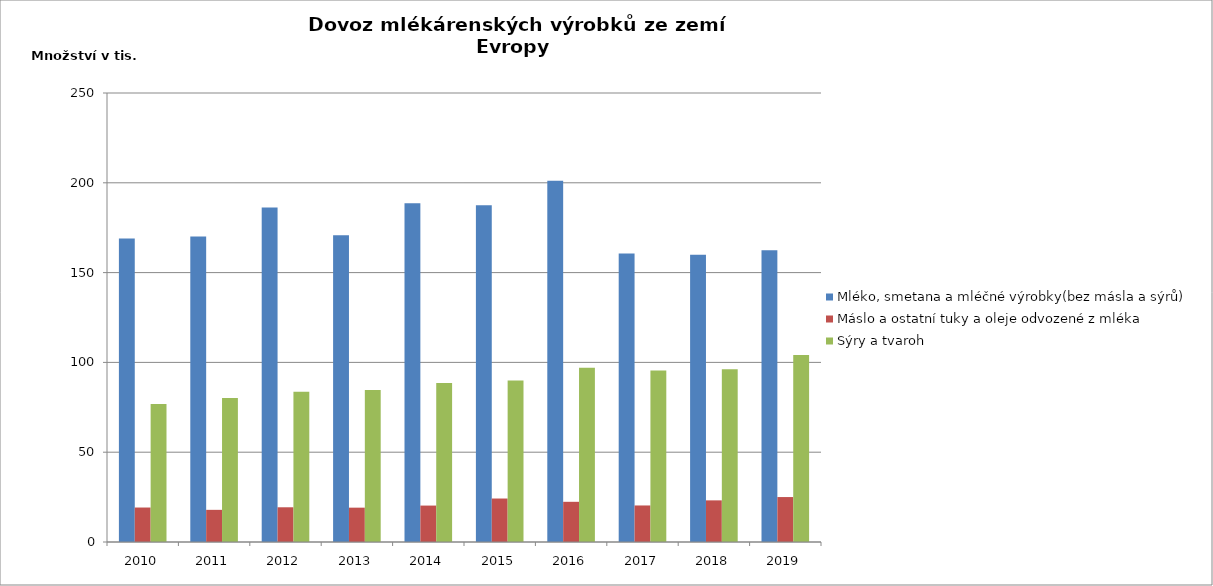
| Category | Mléko, smetana a mléčné výrobky(bez másla a sýrů)  | Máslo a ostatní tuky a oleje odvozené z mléka | Sýry a tvaroh |
|---|---|---|---|
| 2010 | 168991699 | 19196060 | 76845176 |
| 2011 | 170124145 | 17902958 | 80138963 |
| 2012 | 186308942 | 19334351 | 83708218 |
| 2013 | 170851050 | 19121034 | 84694131 |
| 2014 | 188625632 | 20281822 | 88524573 |
| 2015 | 187476154 | 24210378 | 89877725 |
| 2016 | 201129058 | 22376898 | 97010750 |
| 2017 | 160605349 | 20343634 | 95545737 |
| 2018 | 159882395 | 23183496 | 96254828 |
| 2019 | 162451789 | 25025629 | 104174399 |